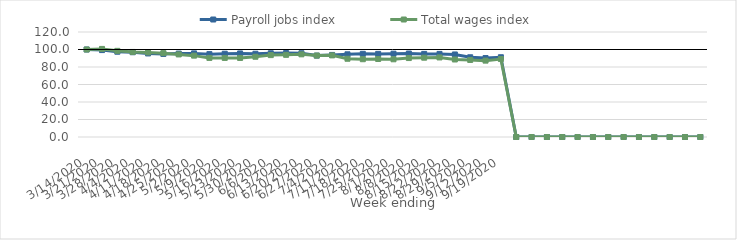
| Category | Payroll jobs index | Total wages index |
|---|---|---|
| 14/03/2020 | 100 | 100 |
| 21/03/2020 | 99.33 | 100.67 |
| 28/03/2020 | 97.456 | 98.449 |
| 04/04/2020 | 96.869 | 97.205 |
| 11/04/2020 | 95.499 | 96.663 |
| 18/04/2020 | 94.911 | 95.845 |
| 25/04/2020 | 95.323 | 94.364 |
| 02/05/2020 | 95.57 | 92.984 |
| 09/05/2020 | 94.715 | 90.376 |
| 16/05/2020 | 95.181 | 90.375 |
| 23/05/2020 | 95.5 | 90.325 |
| 30/05/2020 | 95.158 | 91.704 |
| 06/06/2020 | 95.699 | 93.585 |
| 13/06/2020 | 95.976 | 93.887 |
| 20/06/2020 | 95.731 | 94.476 |
| 27/06/2020 | 93.04 | 93.07 |
| 04/07/2020 | 93.794 | 93.284 |
| 11/07/2020 | 94.514 | 89.424 |
| 18/07/2020 | 95.07 | 88.876 |
| 25/07/2020 | 94.995 | 89.145 |
| 01/08/2020 | 95.209 | 88.804 |
| 08/08/2020 | 95.391 | 90.216 |
| 15/08/2020 | 94.975 | 90.64 |
| 22/08/2020 | 94.953 | 90.911 |
| 29/08/2020 | 94.323 | 88.573 |
| 05/09/2020 | 91.118 | 88.046 |
| 12/09/2020 | 90.245 | 87.278 |
| 19/09/2020 | 91.16 | 89.082 |